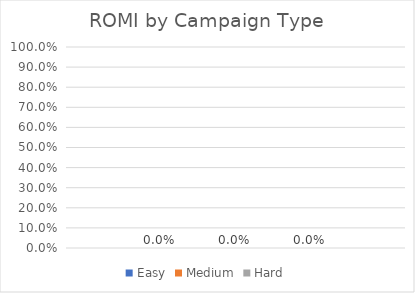
| Category | Easy | Medium | Hard |
|---|---|---|---|
| Campaign | 0 | 0 | 0 |